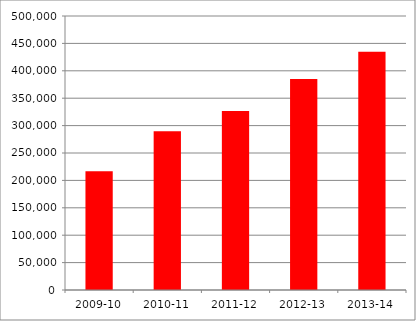
| Category | Series 0 |
|---|---|
| 2009-10 | 216810.138 |
| 2010-11 | 289907.919 |
| 2011-12 | 326837.137 |
| 2012-13 | 384874.768 |
| 2013-14 | 434864 |